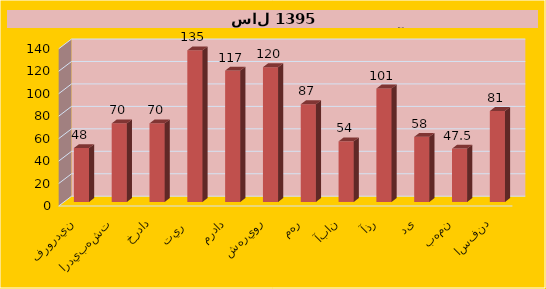
| Category | Series 0 |
|---|---|
| فروردين | 48 |
| ارديبهشت | 70 |
| خرداد | 70 |
| تير  | 135 |
| مرداد | 117 |
| شهريور | 120 |
| مهر | 87 |
| آبان | 54 |
| آذر | 101 |
| دی | 58 |
| بهمن | 47.5 |
| اسفند | 81 |